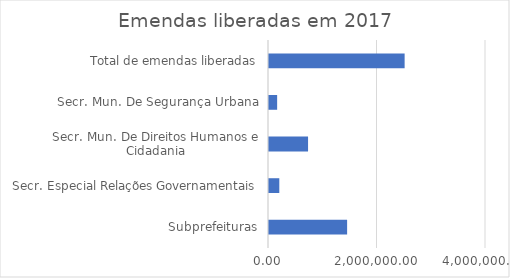
| Category | Valor |
|---|---|
| Subprefeituras | 1440000 |
| Secr. Especial Relações Governamentais | 190000 |
| Secr. Mun. De Direitos Humanos e Cidadania | 720000 |
| Secr. Mun. De Segurança Urbana | 150000 |
| Total de emendas liberadas | 2500000 |